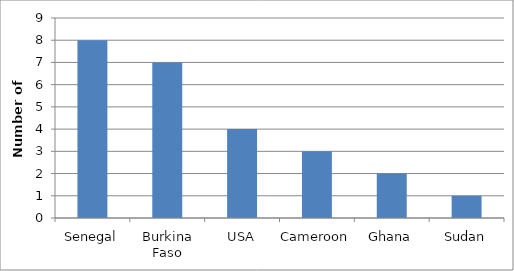
| Category | Series 0 |
|---|---|
| Senegal | 8 |
| Burkina Faso | 7 |
| USA | 4 |
| Cameroon | 3 |
| Ghana | 2 |
| Sudan | 1 |